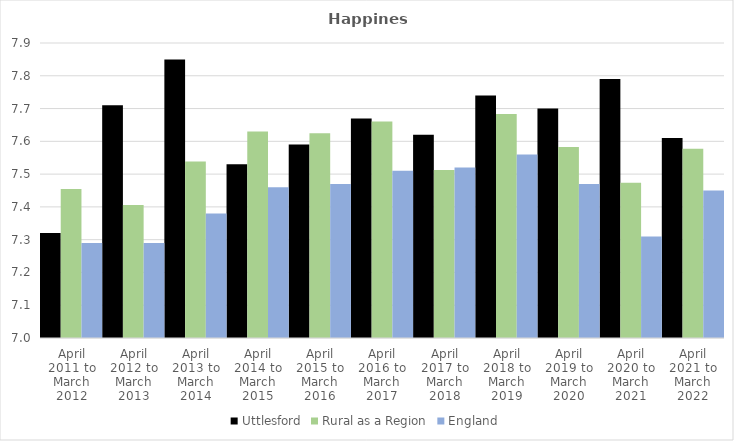
| Category | Uttlesford | Rural as a Region | England |
|---|---|---|---|
| April 2011 to March 2012 | 7.32 | 7.454 | 7.29 |
| April 2012 to March 2013 | 7.71 | 7.406 | 7.29 |
| April 2013 to March 2014 | 7.85 | 7.539 | 7.38 |
| April 2014 to March 2015 | 7.53 | 7.63 | 7.46 |
| April 2015 to March 2016 | 7.59 | 7.625 | 7.47 |
| April 2016 to March 2017 | 7.67 | 7.661 | 7.51 |
| April 2017 to March 2018 | 7.62 | 7.513 | 7.52 |
| April 2018 to March 2019 | 7.74 | 7.684 | 7.56 |
| April 2019 to March 2020 | 7.7 | 7.582 | 7.47 |
| April 2020 to March 2021 | 7.79 | 7.474 | 7.31 |
| April 2021 to March 2022 | 7.61 | 7.577 | 7.45 |